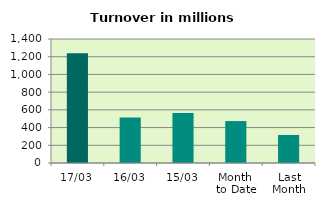
| Category | Series 0 |
|---|---|
| 17/03 | 1239.158 |
| 16/03 | 515.04 |
| 15/03 | 565.218 |
| Month 
to Date | 473.149 |
| Last
Month | 316.082 |